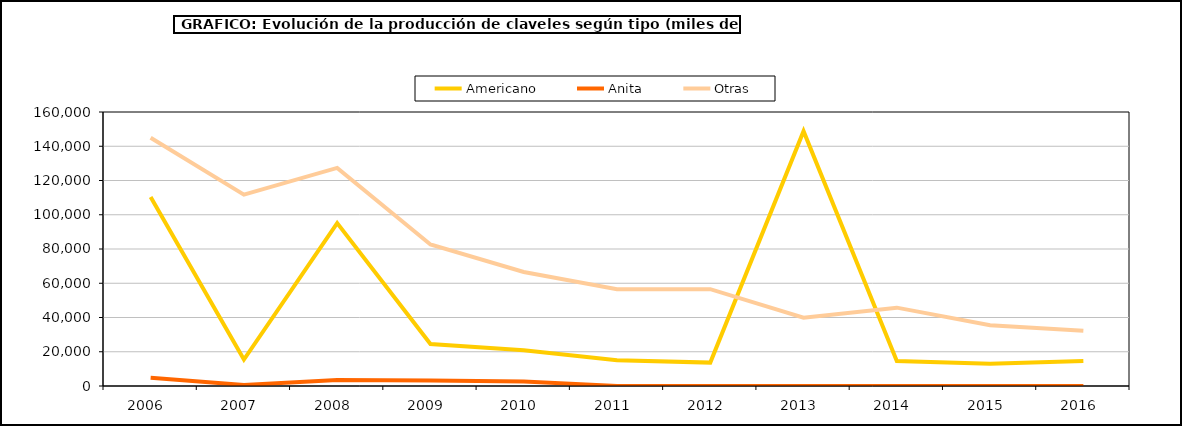
| Category | Americano | Anita | Otras |
|---|---|---|---|
| 2006.0 | 110407 | 4860 | 144998 |
| 2007.0 | 15463 | 580 | 111759 |
| 2008.0 | 95155 | 3544 | 127363 |
| 2009.0 | 24555 | 3160 | 82622 |
| 2010.0 | 20931 | 2642 | 66553 |
| 2011.0 | 15002 | 54 | 56550 |
| 2012.0 | 13658 | 0 | 56550 |
| 2013.0 | 148800 | 0 | 39920 |
| 2014.0 | 14528 | 0 | 45749 |
| 2015.0 | 13065 | 0 | 35460 |
| 2016.0 | 14654 | 0 | 32202 |